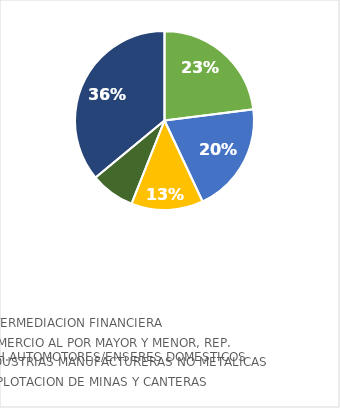
| Category | Series 0 |
|---|---|
| INTERMEDIACION FINANCIERA | 0.23 |
| COMERCIO AL POR MAYOR Y MENOR, REP. VEH.AUTOMOTORES/ENSERES DOMESTICOS | 0.2 |
| INDUSTRIAS MANUFACTURERAS NO METALICAS | 0.13 |
| EXPLOTACION DE MINAS Y CANTERAS | 0.08 |
| OTROS RUBROS | 0.36 |